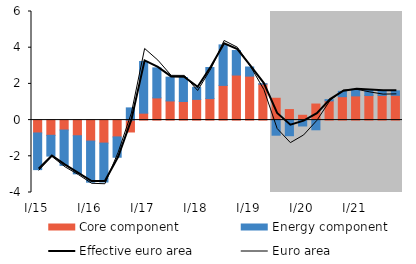
| Category | Core component | Energy component |
|---|---|---|
| I/15 | -0.711 | -2.024 |
| II | -0.841 | -1.148 |
| III | -0.549 | -1.953 |
| IV | -0.865 | -2.104 |
| I/16 | -1.16 | -2.271 |
| II | -1.271 | -2.151 |
| III | -0.929 | -1.123 |
| IV | -0.656 | 0.675 |
| I/17 | 0.384 | 2.852 |
| II | 1.226 | 1.659 |
| III | 1.059 | 1.316 |
| IV | 1.027 | 1.322 |
| I/18 | 1.145 | 0.664 |
| II | 1.189 | 1.718 |
| III | 1.916 | 2.239 |
| IV | 2.49 | 1.354 |
| I/19 | 2.429 | 0.504 |
| II | 1.987 | 0.025 |
| III | 1.207 | -0.835 |
| IV | 0.582 | -0.863 |
| I/20 | 0.267 | -0.325 |
| II | 0.888 | -0.535 |
| III | 1.062 | 0.071 |
| IV | 1.294 | 0.295 |
| I/21 | 1.338 | 0.36 |
| II | 1.356 | 0.303 |
| III | 1.362 | 0.244 |
| IV | 1.368 | 0.246 |